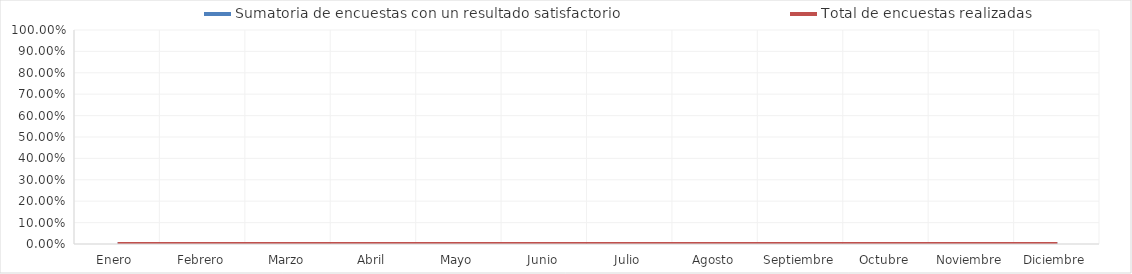
| Category | Sumatoria de encuestas con un resultado satisfactorio   | Total de encuestas realizadas |
|---|---|---|
| Enero  | 0 | 0 |
| Febrero | 0 | 0 |
| Marzo | 0 | 0 |
| Abril | 0 | 0 |
| Mayo | 0 | 0 |
| Junio | 0 | 0 |
| Julio | 0 | 0 |
| Agosto | 0 | 0 |
| Septiembre | 0 | 0 |
| Octubre | 0 | 0 |
| Noviembre | 0 | 0 |
| Diciembre | 0 | 0 |